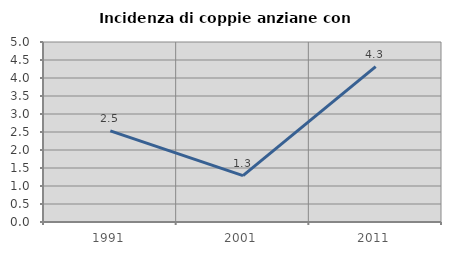
| Category | Incidenza di coppie anziane con figli |
|---|---|
| 1991.0 | 2.532 |
| 2001.0 | 1.29 |
| 2011.0 | 4.317 |